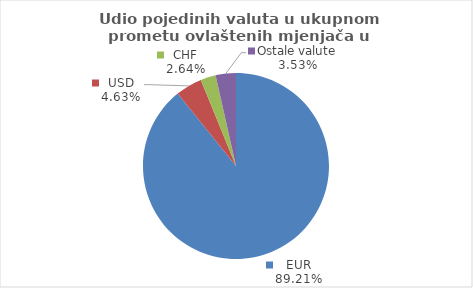
| Category | Series 0 |
|---|---|
| EUR | 89.206 |
| USD | 4.626 |
| CHF | 2.64 |
| Ostale valute | 3.528 |